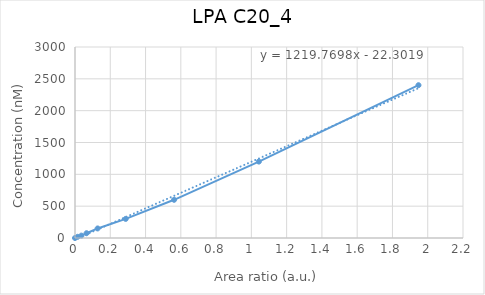
| Category | LPA C20_4 |
|---|---|
| 0.0 | 0 |
| 0.0148925 | 18.75 |
| 0.0360597 | 37.5 |
| 0.0655688 | 75 |
| 0.128326 | 150 |
| 0.28758 | 300 |
| 0.561793 | 600 |
| 1.04255 | 1200 |
| 1.94758 | 2400 |